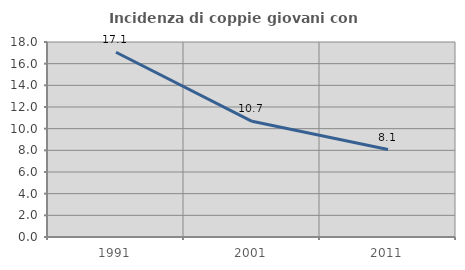
| Category | Incidenza di coppie giovani con figli |
|---|---|
| 1991.0 | 17.054 |
| 2001.0 | 10.676 |
| 2011.0 | 8.069 |